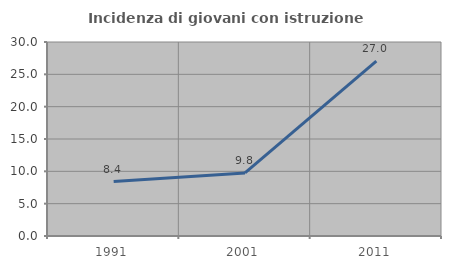
| Category | Incidenza di giovani con istruzione universitaria |
|---|---|
| 1991.0 | 8.411 |
| 2001.0 | 9.756 |
| 2011.0 | 27.049 |